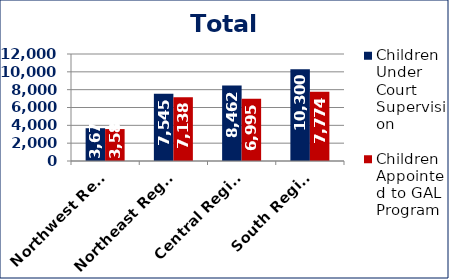
| Category | Children Under Court Supervision  | Children Appointed to GAL Program  |
|---|---|---|
| Northwest Region | 3676 | 3580 |
| Northeast Region | 7545 | 7138 |
| Central Region | 8462 | 6995 |
| South Region | 10300 | 7774 |